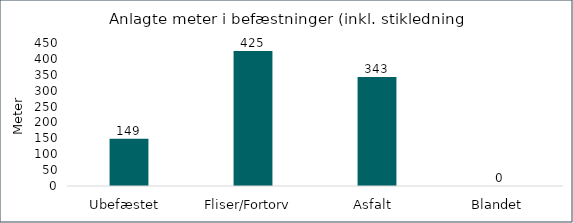
| Category | Series 1 |
|---|---|
| Ubefæstet  | 149 |
| Fliser/Fortorv  | 425 |
| Asfalt  | 343 |
| Blandet  | 0 |